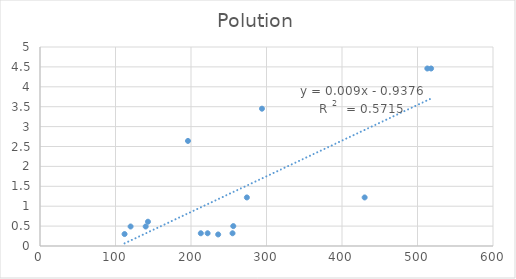
| Category | Polution |
|---|---|
| 112.0 | 0.3 |
| 140.0 | 0.49 |
| 143.0 | 0.61 |
| 120.0 | 0.49 |
| 196.0 | 2.64 |
| 294.0 | 3.45 |
| 513.0 | 4.46 |
| 518.0 | 4.46 |
| 430.0 | 1.22 |
| 274.0 | 1.22 |
| 255.0 | 0.32 |
| 236.0 | 0.29 |
| 256.0 | 0.5 |
| 222.0 | 0.32 |
| 213.0 | 0.32 |